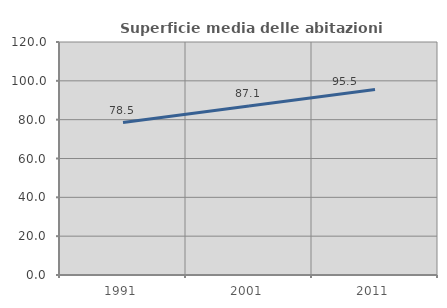
| Category | Superficie media delle abitazioni occupate |
|---|---|
| 1991.0 | 78.526 |
| 2001.0 | 87.054 |
| 2011.0 | 95.528 |